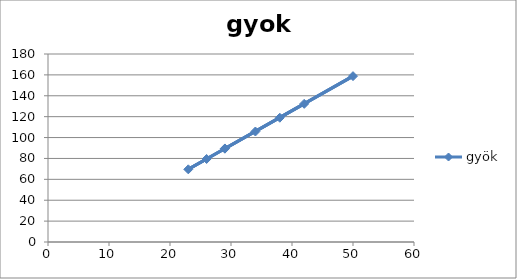
| Category | gyök |
|---|---|
| 29.0 | 89.58 |
| 50.0 | 158.797 |
| 23.0 | 69.591 |
| 26.0 | 79.488 |
| 29.0 | 89.334 |
| 34.0 | 105.789 |
| 38.0 | 118.993 |
| 42.0 | 132.283 |